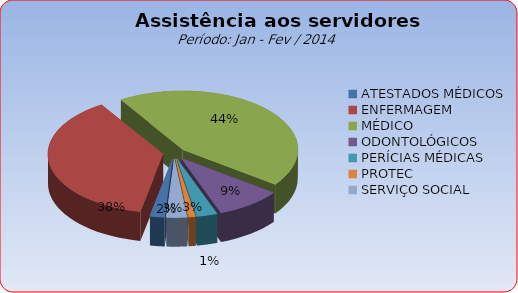
| Category | Series 0 |
|---|---|
| ATESTADOS MÉDICOS | 2.063 |
| ENFERMAGEM | 37.827 |
| MÉDICO | 44.154 |
| ODONTOLÓGICOS | 9.216 |
| PERÍCIAS MÉDICAS | 2.889 |
| PROTEC | 0.963 |
| SERVIÇO SOCIAL | 2.889 |